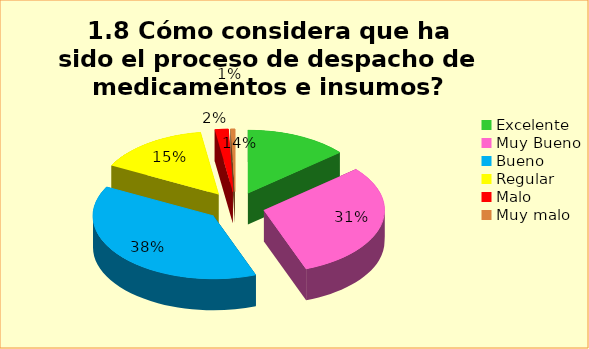
| Category | Series 0 |
|---|---|
| Excelente | 0.138 |
| Muy Bueno | 0.305 |
| Bueno  | 0.383 |
| Regular  | 0.15 |
| Malo  | 0.018 |
| Muy malo  | 0.006 |